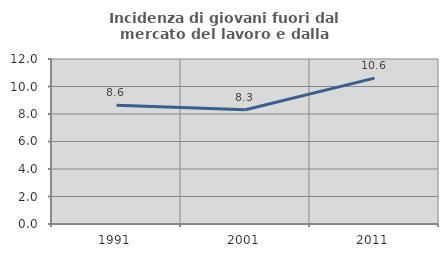
| Category | Incidenza di giovani fuori dal mercato del lavoro e dalla formazione  |
|---|---|
| 1991.0 | 8.632 |
| 2001.0 | 8.311 |
| 2011.0 | 10.61 |